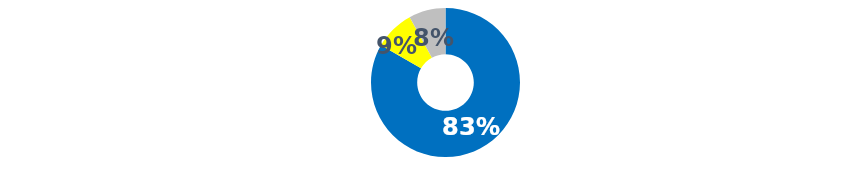
| Category | Series 0 |
|---|---|
| 0 | 115 |
| 1 | 0 |
| 2 | 12 |
| 3 | 0 |
| 4 | 0 |
| 5 | 11 |